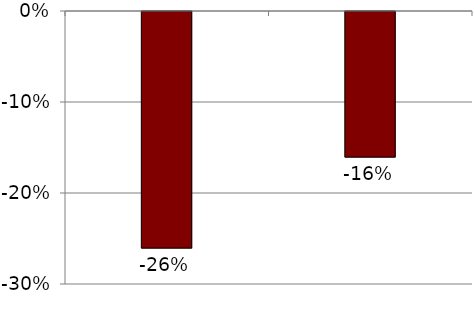
| Category | Series 0 |
|---|---|
|  | -0.26 |
|  | -0.16 |